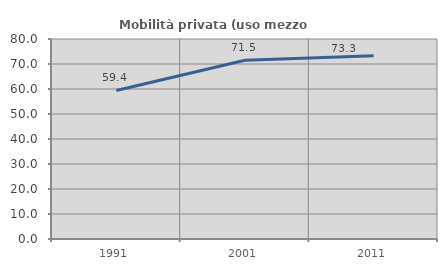
| Category | Mobilità privata (uso mezzo privato) |
|---|---|
| 1991.0 | 59.424 |
| 2001.0 | 71.497 |
| 2011.0 | 73.331 |